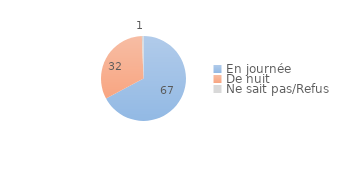
| Category | Series 0 |
|---|---|
| En journée | 67 |
| De nuit | 32.148 |
| Ne sait pas/Refus | 0.608 |